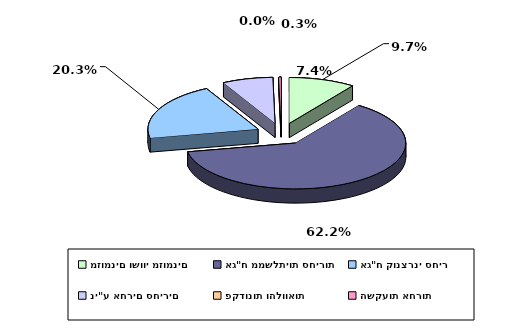
| Category | Series 0 |
|---|---|
| מזומנים ושווי מזומנים | 0.097 |
| אג"ח ממשלתיות סחירות | 0.622 |
| אג"ח קונצרני סחיר | 0.203 |
| ני"ע אחרים סחירים | 0.074 |
| פקדונות והלוואות | 0 |
| השקעות אחרות | 0.003 |